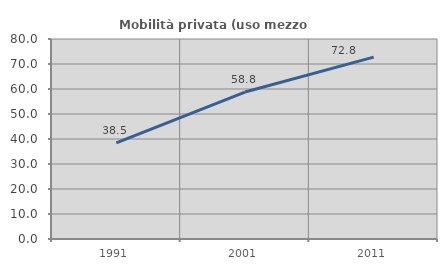
| Category | Mobilità privata (uso mezzo privato) |
|---|---|
| 1991.0 | 38.462 |
| 2001.0 | 58.784 |
| 2011.0 | 72.764 |